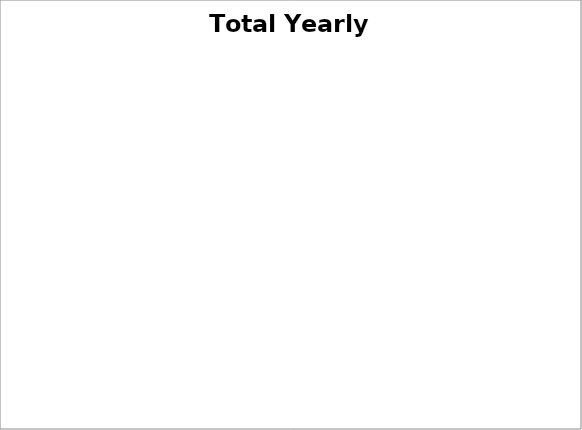
| Category | Series 0 |
|---|---|
| Groceries | 0 |
| Dining Out | 0 |
| Fuel | 0 |
| Car Maintenance | 0 |
| Self Care | 0 |
| Entertainment | 0 |
| Alcohol/Tobacco | 0 |
| Gifts | 0 |
| Clothes | 0 |
| Bills | 0 |
| Loans | 0 |
| Other | 0 |